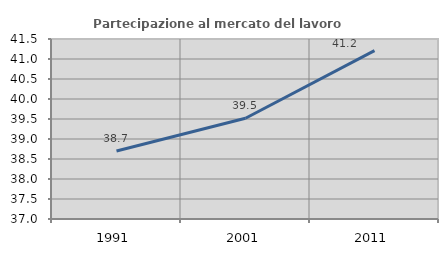
| Category | Partecipazione al mercato del lavoro  femminile |
|---|---|
| 1991.0 | 38.699 |
| 2001.0 | 39.519 |
| 2011.0 | 41.209 |